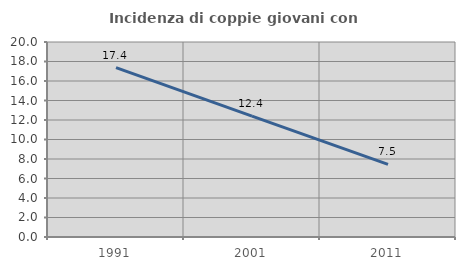
| Category | Incidenza di coppie giovani con figli |
|---|---|
| 1991.0 | 17.38 |
| 2001.0 | 12.394 |
| 2011.0 | 7.457 |